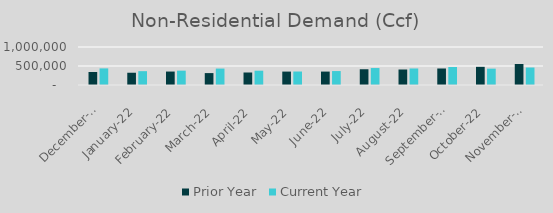
| Category | Prior Year | Current Year |
|---|---|---|
| 2021-12-01 | 342584.594 | 436956.784 |
| 2022-01-01 | 322657.16 | 364164.019 |
| 2022-02-01 | 354041 | 377149.369 |
| 2022-03-01 | 313343 | 432270.798 |
| 2022-04-01 | 329084.722 | 376255.784 |
| 2022-05-01 | 353085 | 354792 |
| 2022-06-01 | 353141.442 | 367009.666 |
| 2022-07-01 | 414577.112 | 446288 |
| 2022-08-01 | 407774.995 | 434730.757 |
| 2022-09-01 | 434192.442 | 474194 |
| 2022-10-01 | 477878.526 | 430055 |
| 2022-11-01 | 552599.698 | 460152.938 |